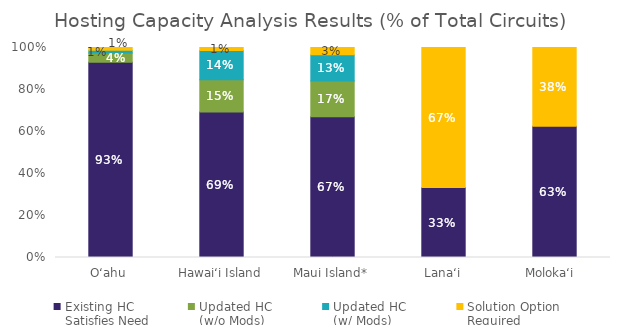
| Category | Existing HC 
Satisfies Need | Updated HC 
(w/o Mods) 
Satisfies Need | Updated HC 
(w/ Mods) 
Satisfies Need | Solution Option 
Required |
|---|---|---|---|---|
| O‘ahu | 0.93 | 0.044 | 0.013 | 0.013 |
| Hawai‘i Island | 0.693 | 0.153 | 0.139 | 0.015 |
| Maui Island* | 0.67 | 0.17 | 0.125 | 0.034 |
| Lana‘i | 0.333 | 0 | 0 | 0.667 |
| Moloka‘i  | 0.625 | 0 | 0 | 0.375 |